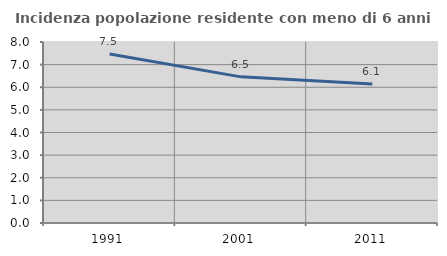
| Category | Incidenza popolazione residente con meno di 6 anni |
|---|---|
| 1991.0 | 7.468 |
| 2001.0 | 6.459 |
| 2011.0 | 6.144 |